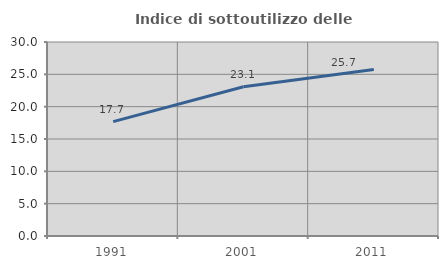
| Category | Indice di sottoutilizzo delle abitazioni  |
|---|---|
| 1991.0 | 17.694 |
| 2001.0 | 23.069 |
| 2011.0 | 25.736 |